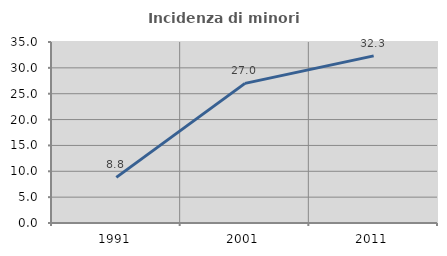
| Category | Incidenza di minori stranieri |
|---|---|
| 1991.0 | 8.824 |
| 2001.0 | 27 |
| 2011.0 | 32.318 |